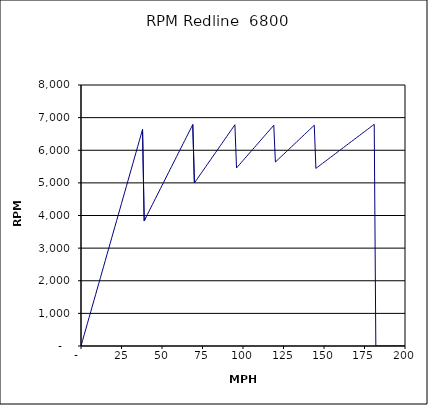
| Category | RPM Redline  6800 |
|---|---|
| 0.0 | 0 |
| 1.0 | 174.709 |
| 2.0 | 349.418 |
| 3.0 | 524.127 |
| 4.0 | 698.836 |
| 5.0 | 873.545 |
| 6.0 | 1048.254 |
| 7.0 | 1222.963 |
| 8.0 | 1397.672 |
| 9.0 | 1572.381 |
| 10.0 | 1747.09 |
| 11.0 | 1921.799 |
| 12.0 | 2096.508 |
| 13.0 | 2271.217 |
| 14.0 | 2445.926 |
| 15.0 | 2620.635 |
| 16.0 | 2795.344 |
| 17.0 | 2970.053 |
| 18.0 | 3144.762 |
| 19.0 | 3319.471 |
| 20.0 | 3494.18 |
| 21.0 | 3668.889 |
| 22.0 | 3843.598 |
| 23.0 | 4018.307 |
| 24.0 | 4193.016 |
| 25.0 | 4367.725 |
| 26.0 | 4542.434 |
| 27.0 | 4717.143 |
| 28.0 | 4891.852 |
| 29.0 | 5066.561 |
| 30.0 | 5241.27 |
| 31.0 | 5415.979 |
| 32.0 | 5590.688 |
| 33.0 | 5765.397 |
| 34.0 | 5940.106 |
| 35.0 | 6114.815 |
| 36.0 | 6289.524 |
| 37.0 | 6464.233 |
| 38.0 | 6638.942 |
| 39.0 | 3836.734 |
| 40.0 | 3935.112 |
| 41.0 | 4033.49 |
| 42.0 | 4131.868 |
| 43.0 | 4230.245 |
| 44.0 | 4328.623 |
| 45.0 | 4427.001 |
| 46.0 | 4525.379 |
| 47.0 | 4623.757 |
| 48.0 | 4722.134 |
| 49.0 | 4820.512 |
| 50.0 | 4918.89 |
| 51.0 | 5017.268 |
| 52.0 | 5115.646 |
| 53.0 | 5214.023 |
| 54.0 | 5312.401 |
| 55.0 | 5410.779 |
| 56.0 | 5509.157 |
| 57.0 | 5607.535 |
| 58.0 | 5705.912 |
| 59.0 | 5804.29 |
| 60.0 | 5902.668 |
| 61.0 | 6001.046 |
| 62.0 | 6099.424 |
| 63.0 | 6197.801 |
| 64.0 | 6296.179 |
| 65.0 | 6394.557 |
| 66.0 | 6492.935 |
| 67.0 | 6591.313 |
| 68.0 | 6689.69 |
| 69.0 | 6788.068 |
| 70.0 | 4996.677 |
| 71.0 | 5068.058 |
| 72.0 | 5139.439 |
| 73.0 | 5210.82 |
| 74.0 | 5282.202 |
| 75.0 | 5353.583 |
| 76.0 | 5424.964 |
| 77.0 | 5496.345 |
| 78.0 | 5567.726 |
| 79.0 | 5639.107 |
| 80.0 | 5710.488 |
| 81.0 | 5781.869 |
| 82.0 | 5853.25 |
| 83.0 | 5924.631 |
| 84.0 | 5996.013 |
| 85.0 | 6067.394 |
| 86.0 | 6138.775 |
| 87.0 | 6210.156 |
| 88.0 | 6281.537 |
| 89.0 | 6352.918 |
| 90.0 | 6424.299 |
| 91.0 | 6495.68 |
| 92.0 | 6567.061 |
| 93.0 | 6638.442 |
| 94.0 | 6709.824 |
| 95.0 | 6781.205 |
| 96.0 | 5457.576 |
| 97.0 | 5514.426 |
| 98.0 | 5571.276 |
| 99.0 | 5628.125 |
| 100.0 | 5684.975 |
| 101.0 | 5741.825 |
| 102.0 | 5798.675 |
| 103.0 | 5855.524 |
| 104.0 | 5912.374 |
| 105.0 | 5969.224 |
| 106.0 | 6026.074 |
| 107.0 | 6082.923 |
| 108.0 | 6139.773 |
| 109.0 | 6196.623 |
| 110.0 | 6253.473 |
| 111.0 | 6310.322 |
| 112.0 | 6367.172 |
| 113.0 | 6424.022 |
| 114.0 | 6480.872 |
| 115.0 | 6537.721 |
| 116.0 | 6594.571 |
| 117.0 | 6651.421 |
| 118.0 | 6708.271 |
| 119.0 | 6765.12 |
| 120.0 | 5639.255 |
| 121.0 | 5686.249 |
| 122.0 | 5733.243 |
| 123.0 | 5780.237 |
| 124.0 | 5827.231 |
| 125.0 | 5874.224 |
| 126.0 | 5921.218 |
| 127.0 | 5968.212 |
| 128.0 | 6015.206 |
| 129.0 | 6062.2 |
| 130.0 | 6109.193 |
| 131.0 | 6156.187 |
| 132.0 | 6203.181 |
| 133.0 | 6250.175 |
| 134.0 | 6297.169 |
| 135.0 | 6344.162 |
| 136.0 | 6391.156 |
| 137.0 | 6438.15 |
| 138.0 | 6485.144 |
| 139.0 | 6532.138 |
| 140.0 | 6579.131 |
| 141.0 | 6626.125 |
| 142.0 | 6673.119 |
| 143.0 | 6720.113 |
| 144.0 | 6767.106 |
| 145.0 | 5443.924 |
| 146.0 | 5481.468 |
| 147.0 | 5519.012 |
| 148.0 | 5556.556 |
| 149.0 | 5594.101 |
| 150.0 | 5631.645 |
| 151.0 | 5669.189 |
| 152.0 | 5706.734 |
| 153.0 | 5744.278 |
| 154.0 | 5781.822 |
| 155.0 | 5819.367 |
| 156.0 | 5856.911 |
| 157.0 | 5894.455 |
| 158.0 | 5931.999 |
| 159.0 | 5969.544 |
| 160.0 | 6007.088 |
| 161.0 | 6044.632 |
| 162.0 | 6082.177 |
| 163.0 | 6119.721 |
| 164.0 | 6157.265 |
| 165.0 | 6194.81 |
| 166.0 | 6232.354 |
| 167.0 | 6269.898 |
| 168.0 | 6307.442 |
| 169.0 | 6344.987 |
| 170.0 | 6382.531 |
| 171.0 | 6420.075 |
| 172.0 | 6457.62 |
| 173.0 | 6495.164 |
| 174.0 | 6532.708 |
| 175.0 | 6570.253 |
| 176.0 | 6607.797 |
| 177.0 | 6645.341 |
| 178.0 | 6682.885 |
| 179.0 | 6720.43 |
| 180.0 | 6757.974 |
| 181.0 | 6795.518 |
| 182.0 | 0 |
| 183.0 | 0 |
| 184.0 | 0 |
| 185.0 | 0 |
| 186.0 | 0 |
| 187.0 | 0 |
| 188.0 | 0 |
| 189.0 | 0 |
| 190.0 | 0 |
| 191.0 | 0 |
| 192.0 | 0 |
| 193.0 | 0 |
| 194.0 | 0 |
| 195.0 | 0 |
| 196.0 | 0 |
| 197.0 | 0 |
| 198.0 | 0 |
| 199.0 | 0 |
| 200.0 | 0 |